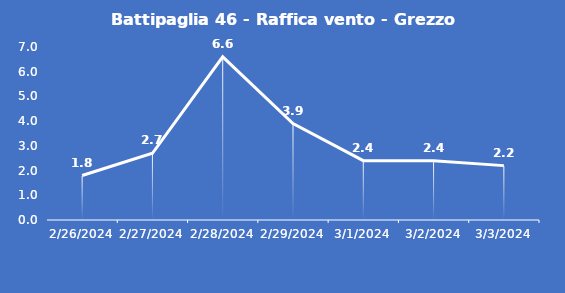
| Category | Battipaglia 46 - Raffica vento - Grezzo (m/s) |
|---|---|
| 2/26/24 | 1.8 |
| 2/27/24 | 2.7 |
| 2/28/24 | 6.6 |
| 2/29/24 | 3.9 |
| 3/1/24 | 2.4 |
| 3/2/24 | 2.4 |
| 3/3/24 | 2.2 |